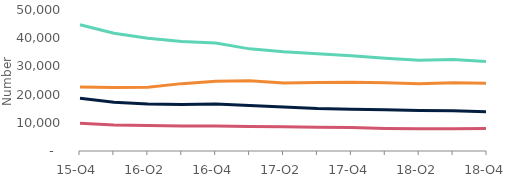
| Category | Arrears of 2.5%-5% of balance | Arrears of 5%-7.5% of balance | Arrears of 7.5%-10% of balance | Arrears over 10% of balance |
|---|---|---|---|---|
| 15-Q4 | 44790 | 18680 | 9860 | 22680 |
| 16-Q1 | 41750 | 17290 | 9260 | 22490 |
| 16-Q2 | 39980 | 16660 | 9040 | 22590 |
| 16-Q3 | 38790 | 16450 | 8880 | 23890 |
| 16-Q4 | 38270 | 16660 | 8860 | 24760 |
| 17-Q1 | 36220 | 16100 | 8730 | 24880 |
| 17-Q2 | 35200 | 15630 | 8600 | 24130 |
| 17-Q3 | 34480 | 15050 | 8420 | 24250 |
| 17-Q4 | 33810 | 14810 | 8290 | 24380 |
| 18-Q1 | 32900 | 14590 | 8000 | 24180 |
| 18-Q2 | 32140 | 14380 | 7870 | 23850 |
| 18-Q3 | 32480 | 14260 | 7880 | 24160 |
| 18-Q4 | 31730 | 13890 | 7970 | 24020 |